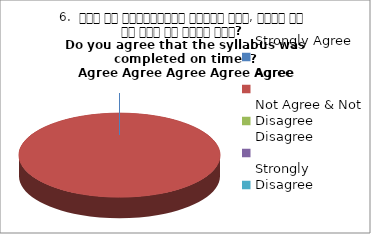
| Category | 6.  समय पर पाठ्यक्रम पूर्ण हुआ, क्या आप इस बात से सहमत हैं? 
Do you agree that the syllabus was completed on time  ?
 Agree Agree Agree Agree Agree |
|---|---|
| Strongly Agree | 0 |
| Agree | 5 |
| Not Agree & Not Disagree | 0 |
| Disagree | 0 |
| Strongly Disagree | 0 |